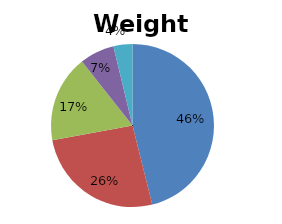
| Category | Pesos |
|---|---|
| C1 | 0.461 |
| C2 | 0.26 |
| C3 | 0.172 |
| C4 | 0.069 |
| C5 | 0.038 |